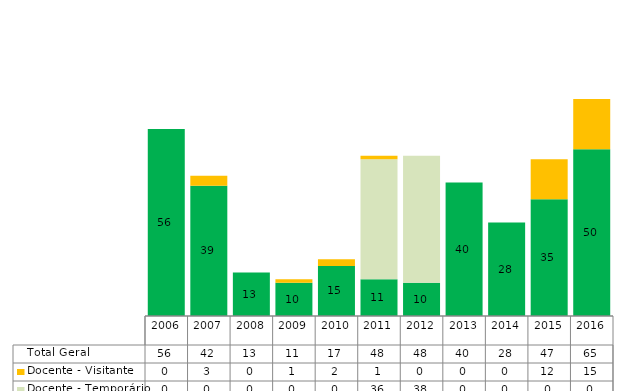
| Category | Docente - Substituto | Docente - Temporário | Docente - Visitante | Total Geral |
|---|---|---|---|---|
| 2006.0 | 56 | 0 | 0 | 56 |
| 2007.0 | 39 | 0 | 3 | 42 |
| 2008.0 | 13 | 0 | 0 | 13 |
| 2009.0 | 10 | 0 | 1 | 11 |
| 2010.0 | 15 | 0 | 2 | 17 |
| 2011.0 | 11 | 36 | 1 | 48 |
| 2012.0 | 10 | 38 | 0 | 48 |
| 2013.0 | 40 | 0 | 0 | 40 |
| 2014.0 | 28 | 0 | 0 | 28 |
| 2015.0 | 35 | 0 | 12 | 47 |
| 2016.0 | 50 | 0 | 15 | 65 |